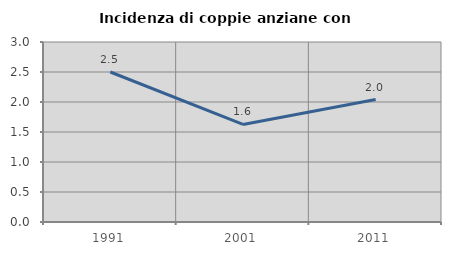
| Category | Incidenza di coppie anziane con figli |
|---|---|
| 1991.0 | 2.5 |
| 2001.0 | 1.626 |
| 2011.0 | 2.041 |